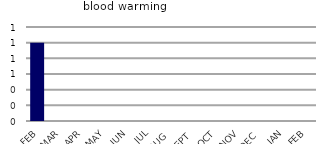
| Category | blood warming |
|---|---|
| FEB | 1 |
| MAR | 0 |
| APR | 0 |
| MAY | 0 |
| JUN | 0 |
| JUL | 0 |
| AUG | 0 |
| SEPT | 0 |
| OCT | 0 |
| NOV | 0 |
| DEC | 0 |
| JAN | 0 |
| FEB | 0 |